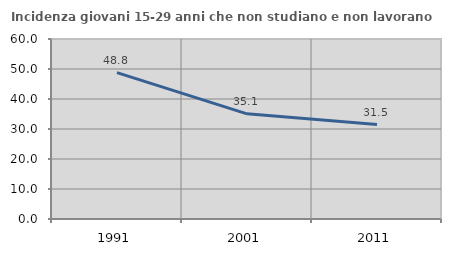
| Category | Incidenza giovani 15-29 anni che non studiano e non lavorano  |
|---|---|
| 1991.0 | 48.806 |
| 2001.0 | 35.052 |
| 2011.0 | 31.481 |